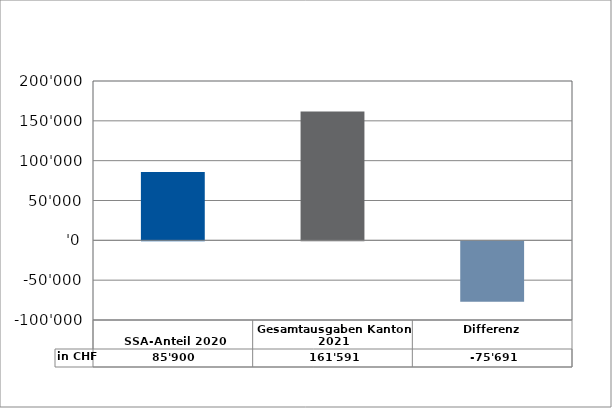
| Category | in CHF |
|---|---|
| 
SSA-Anteil 2020
 | 85900 |
| Gesamtausgaben Kanton 2021
 | 161591 |
| Differenz | -75691 |